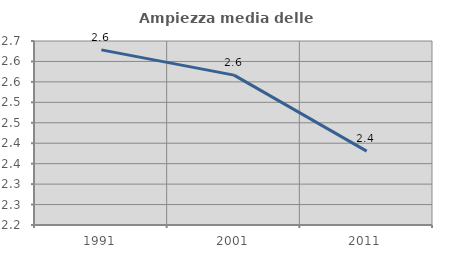
| Category | Ampiezza media delle famiglie |
|---|---|
| 1991.0 | 2.628 |
| 2001.0 | 2.567 |
| 2011.0 | 2.381 |